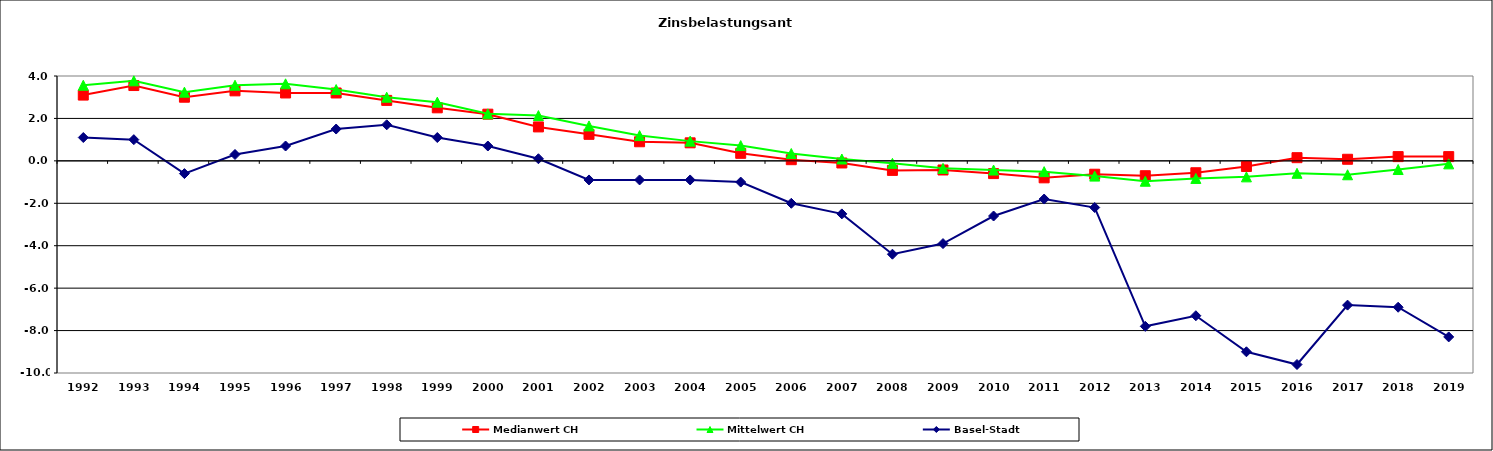
| Category | Medianwert CH | Mittelwert CH | Basel-Stadt |
|---|---|---|---|
| 1992.0 | 3.1 | 3.565 | 1.1 |
| 1993.0 | 3.55 | 3.772 | 1 |
| 1994.0 | 3 | 3.238 | -0.6 |
| 1995.0 | 3.3 | 3.565 | 0.3 |
| 1996.0 | 3.2 | 3.632 | 0.7 |
| 1997.0 | 3.2 | 3.361 | 1.5 |
| 1998.0 | 2.85 | 3 | 1.7 |
| 1999.0 | 2.5 | 2.765 | 1.1 |
| 2000.0 | 2.2 | 2.216 | 0.7 |
| 2001.0 | 1.6 | 2.135 | 0.1 |
| 2002.0 | 1.25 | 1.646 | -0.9 |
| 2003.0 | 0.9 | 1.191 | -0.9 |
| 2004.0 | 0.85 | 0.93 | -0.9 |
| 2005.0 | 0.355 | 0.72 | -1 |
| 2006.0 | 0.055 | 0.346 | -2 |
| 2007.0 | -0.1 | 0.087 | -2.5 |
| 2008.0 | -0.45 | -0.117 | -4.4 |
| 2009.0 | -0.43 | -0.354 | -3.9 |
| 2010.0 | -0.6 | -0.433 | -2.6 |
| 2011.0 | -0.8 | -0.508 | -1.8 |
| 2012.0 | -0.63 | -0.718 | -2.2 |
| 2013.0 | -0.7 | -0.96 | -7.8 |
| 2014.0 | -0.56 | -0.829 | -7.3 |
| 2015.0 | -0.265 | -0.755 | -9 |
| 2016.0 | 0.15 | -0.587 | -9.6 |
| 2017.0 | 0.075 | -0.656 | -6.8 |
| 2018.0 | 0.2 | -0.408 | -6.9 |
| 2019.0 | 0.2 | -0.142 | -8.3 |